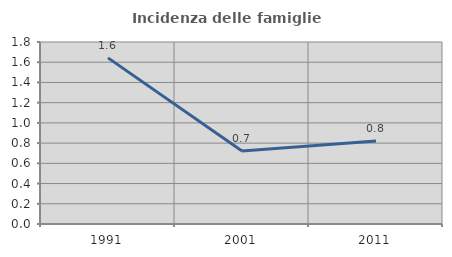
| Category | Incidenza delle famiglie numerose |
|---|---|
| 1991.0 | 1.643 |
| 2001.0 | 0.722 |
| 2011.0 | 0.82 |